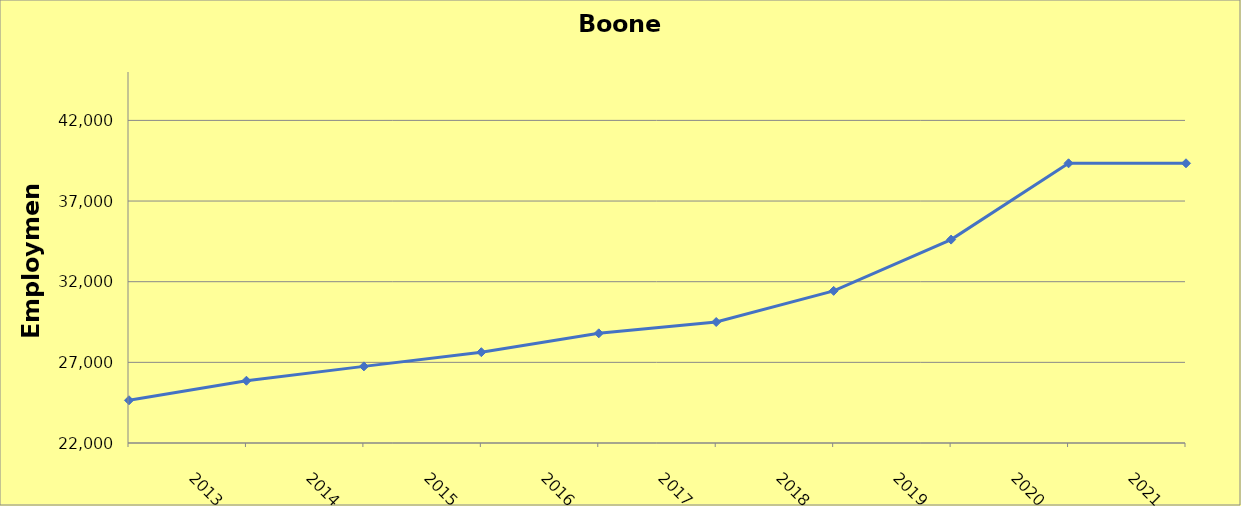
| Category | Boone County |
|---|---|
| 2013.0 | 24650 |
| 2014.0 | 25860 |
| 2015.0 | 26750 |
| 2016.0 | 27630 |
| 2017.0 | 28800 |
| 2018.0 | 29500 |
| 2019.0 | 31430 |
| 2020.0 | 34610 |
| 2021.0 | 39340 |
| 2022.0 | 39342 |